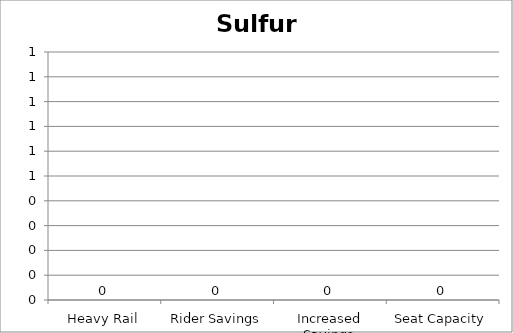
| Category | Sulfur Oxides |
|---|---|
| Heavy Rail | 0 |
| Rider Savings | 0 |
| Increased Savings | 0 |
| Seat Capacity | 0 |